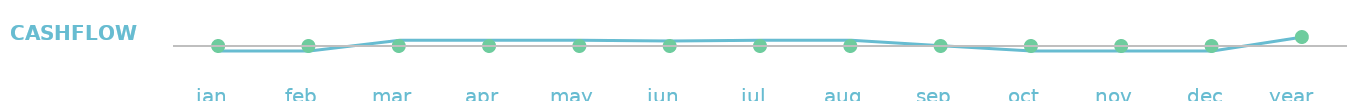
| Category | Cash Flow |
|---|---|
| jan  | -1138.333 |
| feb  | -1138.333 |
| mar  | 1311.667 |
| apr  | 1311.667 |
| may  | 1311.667 |
| jun  | 1111.667 |
| jul  | 1311.667 |
| aug  | 1311.667 |
| sep  | 61.667 |
| oct  | -1138.333 |
| nov  | -1138.333 |
| dec  | -1138.333 |
| year   | 2040 |